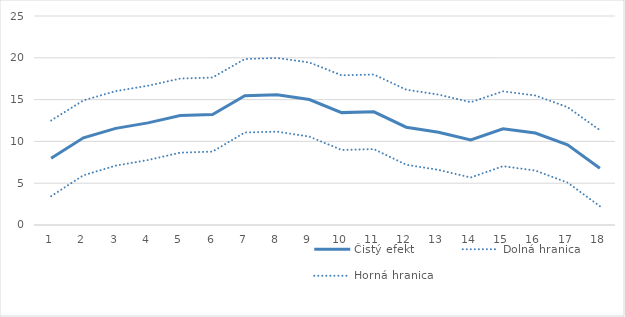
| Category | Čistý efekt | Dolná hranica | Horná hranica |
|---|---|---|---|
| 1.0 | 7.976 | 3.449 | 12.503 |
| 2.0 | 10.426 | 5.946 | 14.905 |
| 3.0 | 11.556 | 7.1 | 16.012 |
| 4.0 | 12.217 | 7.771 | 16.663 |
| 5.0 | 13.084 | 8.653 | 17.515 |
| 6.0 | 13.212 | 8.781 | 17.642 |
| 7.0 | 15.462 | 11.067 | 19.858 |
| 8.0 | 15.572 | 11.168 | 19.975 |
| 9.0 | 15.006 | 10.574 | 19.437 |
| 10.0 | 13.442 | 8.976 | 17.909 |
| 11.0 | 13.538 | 9.078 | 17.998 |
| 12.0 | 11.696 | 7.204 | 16.188 |
| 13.0 | 11.095 | 6.594 | 15.595 |
| 14.0 | 10.187 | 5.681 | 14.693 |
| 15.0 | 11.51 | 7.034 | 15.987 |
| 16.0 | 11.002 | 6.513 | 15.491 |
| 17.0 | 9.582 | 5.07 | 14.093 |
| 18.0 | 6.795 | 2.245 | 11.346 |